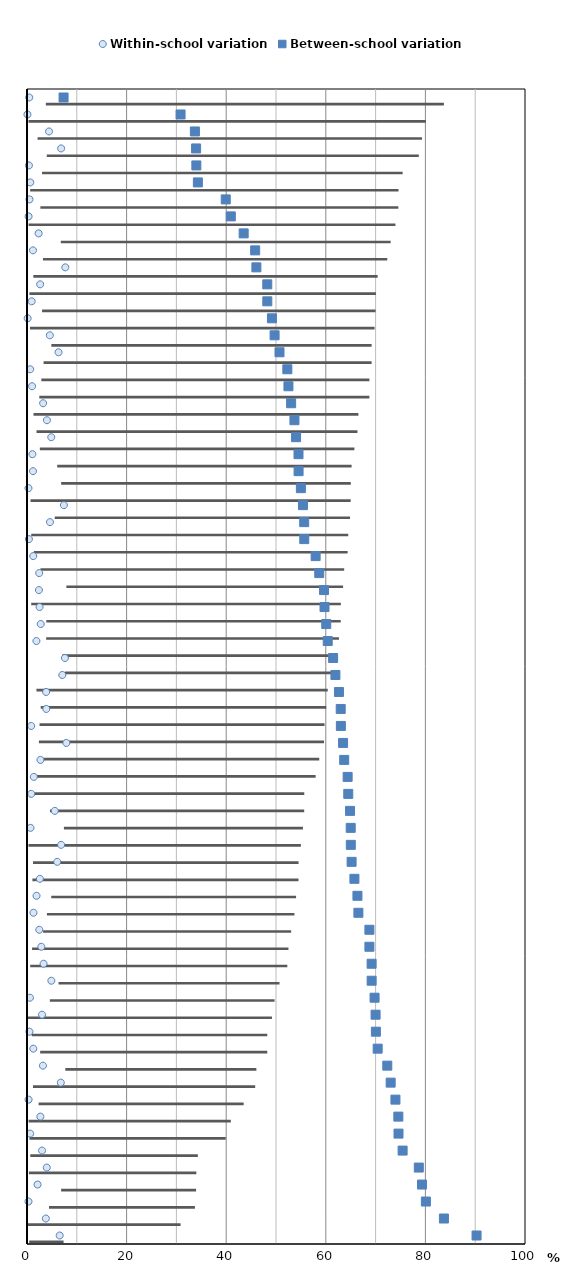
| Category | bar bottom | bars top |
|---|---|---|
| Macao (China) | 0.446 | 6.899 |
| Algeria | 0.09 | 30.748 |
| Jordan | 4.42 | 29.299 |
| Norway | 6.851 | 27.102 |
| United Arab Emirates | 0.385 | 33.621 |
| Qatar | 0.655 | 33.656 |
| Lebanon | 0.498 | 39.411 |
| Hong Kong (China) | 0.316 | 40.612 |
| Russia | 2.335 | 41.173 |
| Viet Nam | 1.198 | 44.618 |
| Finland | 7.691 | 38.369 |
| Estonia | 2.64 | 45.605 |
| Kosovo | 0.939 | 47.316 |
| Turkey | 0.13 | 49.057 |
| Iceland | 4.588 | 45.128 |
| Denmark | 6.329 | 44.374 |
| Tunisia | 0.641 | 51.635 |
| Italy | 1.013 | 51.485 |
| Georgia | 3.237 | 49.8 |
| Canada | 4.002 | 49.701 |
| United States | 4.874 | 49.156 |
| FYROM | 1.087 | 53.433 |
| Mexico | 1.204 | 53.329 |
| Thailand | 0.297 | 54.7 |
| Switzerland | 7.411 | 48.002 |
| Moldova | 4.613 | 51.047 |
| Indonesia | 0.382 | 55.295 |
| Brazil | 1.256 | 56.703 |
| Latvia | 2.451 | 56.231 |
| Lithuania | 2.394 | 57.252 |
| Israel | 2.521 | 57.221 |
| Greece | 2.756 | 57.334 |
| Romania | 1.894 | 58.493 |
| Ireland | 7.616 | 53.853 |
| Spain | 7.093 | 54.836 |
| OECD average | 3.847 | 58.797 |
| Australia | 3.878 | 59.116 |
| Japan | 0.845 | 62.18 |
| Poland | 7.905 | 55.563 |
| Korea | 2.704 | 60.989 |
| Colombia | 1.372 | 63.011 |
| Netherlands | 0.846 | 63.664 |
| Singapore | 5.572 | 59.295 |
| B-S-J-G (China) | 0.705 | 64.295 |
| Sweden | 6.857 | 58.163 |
| Portugal | 6.066 | 59.114 |
| Croatia | 2.58 | 63.166 |
| Dominican Republic | 1.913 | 64.441 |
| Chile | 1.303 | 65.243 |
| Austria | 2.471 | 66.283 |
| Uruguay | 2.878 | 65.878 |
| United Kingdom | 3.331 | 65.868 |
| Malta | 4.891 | 64.314 |
| Montenegro | 0.593 | 69.198 |
| Costa Rica | 3.021 | 66.974 |
| Trinidad and Tobago | 0.487 | 69.573 |
| Slovak Republic | 1.269 | 69.145 |
| Chinese Taipei | 3.203 | 69.144 |
| New Zealand | 6.789 | 66.235 |
| Slovenia | 0.317 | 73.667 |
| Germany | 2.683 | 71.884 |
| Bulgaria | 0.636 | 73.965 |
| Czech Republic | 3.023 | 72.402 |
| Belgium | 3.971 | 74.705 |
| Peru | 2.123 | 77.2 |
| Hungary | 0.299 | 79.798 |
| CABA (Argentina) | 3.785 | 79.935 |
| Luxembourg | 6.562 | 83.711 |